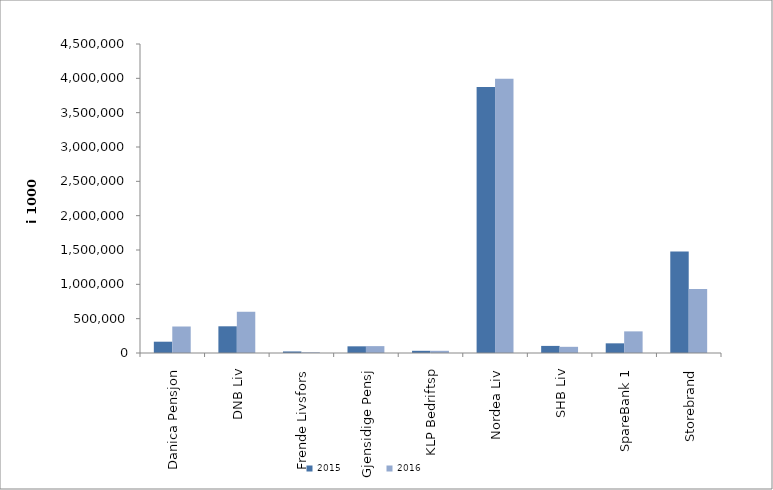
| Category | 2015 | 2016 |
|---|---|---|
| 0 | 164490.052 | 385868.27 |
| 1 | 388846.908 | 600627 |
| 2 | 22604 | 9944 |
| 3 | 97310.705 | 100039.077 |
| 4 | 32118 | 32081 |
| 5 | 3872295.04 | 3993301.455 |
| 6 | 103256 | 90028 |
| 7 | 140827.558 | 314984 |
| 8 | 1477843.389 | 930403.018 |